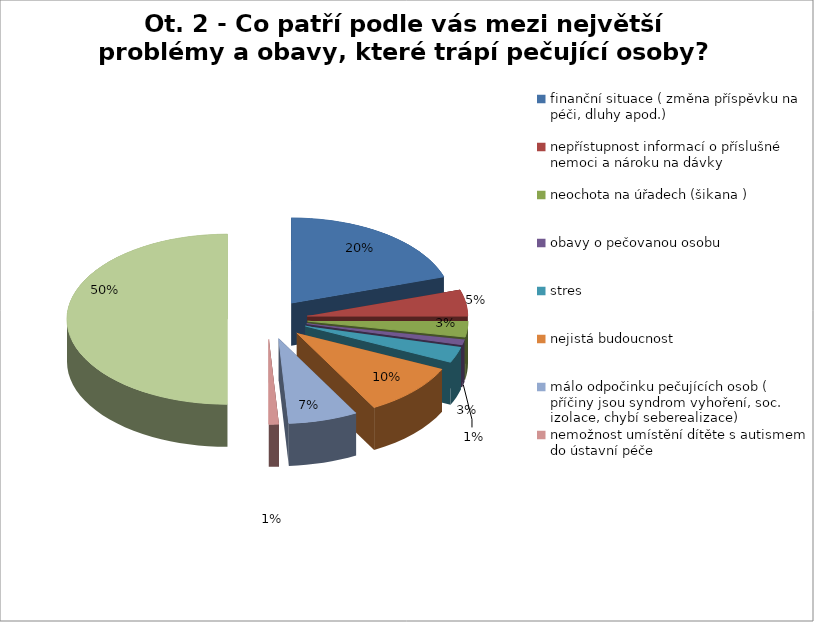
| Category | Ot. 2 - Co patří podle vás mezi největší problémy a obavy, které trápí pečující osoby? proc |
|---|---|
| finanční situace ( změna příspěvku na péči, dluhy apod.) | 0.4 |
| nepřístupnost informací o příslušné nemoci a nároku na dávky | 0.1 |
| neochota na úřadech (šikana ) | 0.06 |
| obavy o pečovanou osobu | 0.02 |
| stres | 0.06 |
| nejistá budoucnost | 0.2 |
| málo odpočinku pečujících osob ( příčiny jsou syndrom vyhoření, soc. izolace, chybí seberealizace) | 0.14 |
| nemožnost umístění dítěte s autismem do ústavní péče | 0.02 |
| celkem společných odpovědí | 1 |